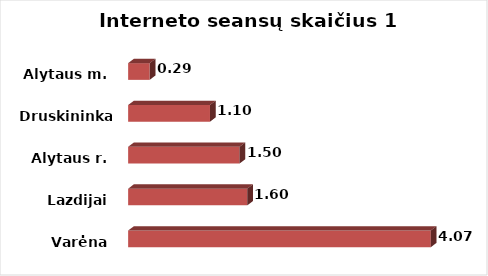
| Category | Series 0 |
|---|---|
| Varėna | 4.07 |
| Lazdijai | 1.602 |
| Alytaus r. | 1.498 |
| Druskininkai  | 1.1 |
| Alytaus m. | 0.289 |